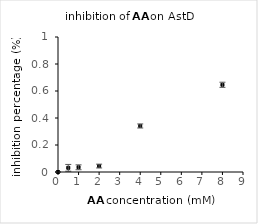
| Category | Series 0 |
|---|---|
| 8.0 | 0.646 |
| 4.0 | 0.341 |
| 2.0 | 0.044 |
| 1.0 | 0.035 |
| 0.5 | 0.031 |
| 0.0 | 0 |